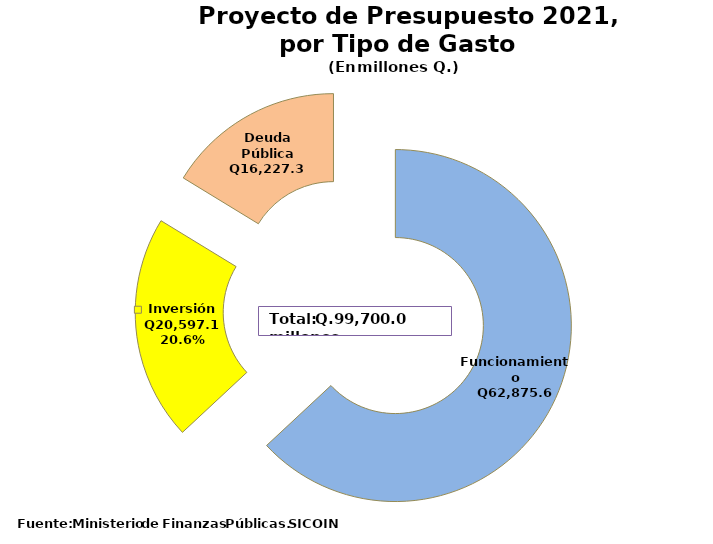
| Category | Recomendado 2017 |
|---|---|
| Funcionamiento | 62875.6 |
| Inversión | 20597.1 |
| Deuda Pública | 16227.3 |